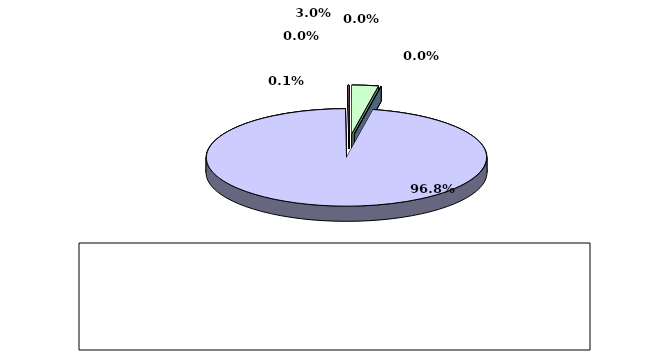
| Category | Series 0 |
|---|---|
| מזומנים ושווי מזומנים | 0.03 |
| אג"ח ממשלתיות סחירות | 0 |
| אג"ח קונצרני סחיר | 0 |
| ני"ע אחרים סחירים | 0.968 |
| פקדונות והלוואות | 0 |
| השקעות אחרות | 0.001 |